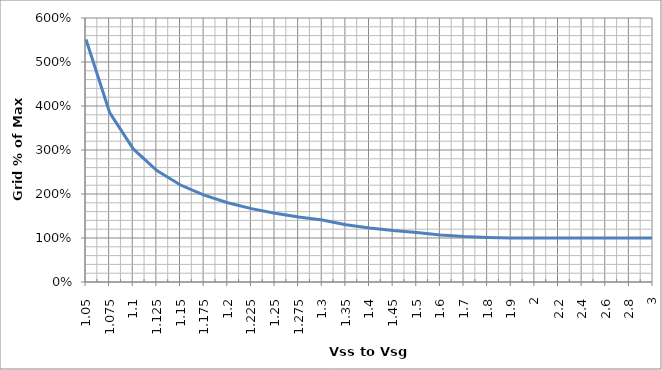
| Category | Series 0 |
|---|---|
| 1.05 | 5.512 |
| 1.075 | 3.852 |
| 1.1 | 3.025 |
| 1.125 | 2.531 |
| 1.1500000000000001 | 2.204 |
| 1.175 | 1.972 |
| 1.2 | 1.8 |
| 1.225 | 1.667 |
| 1.25 | 1.562 |
| 1.2750000000000001 | 1.478 |
| 1.3 | 1.408 |
| 1.35 | 1.302 |
| 1.4000000000000001 | 1.225 |
| 1.45 | 1.168 |
| 1.5 | 1.125 |
| 1.6 | 1.067 |
| 1.7 | 1.032 |
| 1.8 | 1.012 |
| 1.9000000000000001 | 1.003 |
| 2.0 | 1 |
| 2.2 | 1 |
| 2.4 | 1 |
| 2.6 | 1 |
| 2.8000000000000003 | 1 |
| 3.0 | 1 |